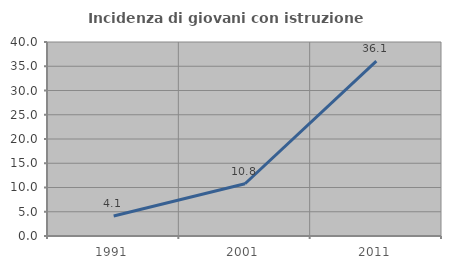
| Category | Incidenza di giovani con istruzione universitaria |
|---|---|
| 1991.0 | 4.11 |
| 2001.0 | 10.778 |
| 2011.0 | 36.066 |